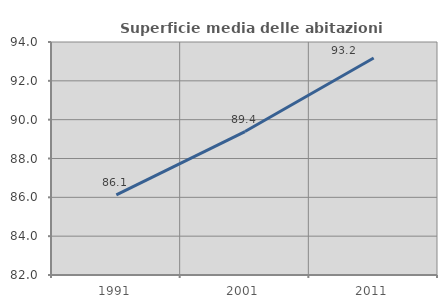
| Category | Superficie media delle abitazioni occupate |
|---|---|
| 1991.0 | 86.123 |
| 2001.0 | 89.387 |
| 2011.0 | 93.176 |